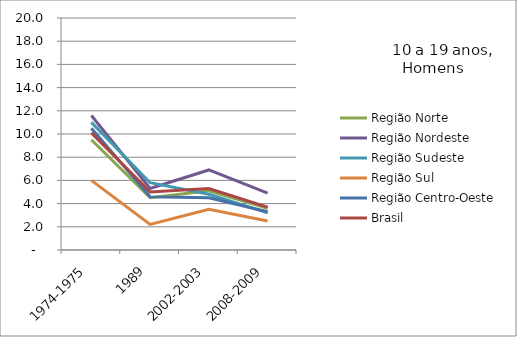
| Category | Região Norte | Região Nordeste | Região Sudeste | Região Sul | Região Centro-Oeste | Brasil |
|---|---|---|---|---|---|---|
| 1974-1975 | 9.5 | 11.6 | 11 | 6 | 10.5 | 10.1 |
| 1989 | 4.5 | 5.3 | 5.8 | 2.2 | 4.6 | 5 |
| 2002-2003 | 5.1 | 6.9 | 4.8 | 3.5 | 4.5 | 5.3 |
| 2008-2009 | 3.6 | 4.9 | 3.2 | 2.5 | 3.3 | 3.7 |